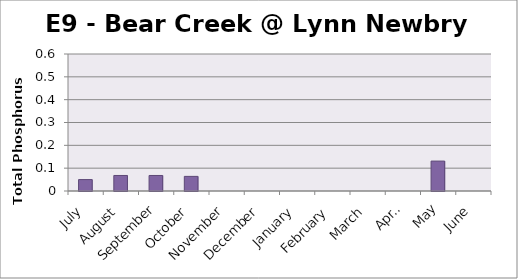
| Category | Phosphorus (mg/L) |
|---|---|
| July | 0.05 |
| August | 0.068 |
| September | 0.068 |
| October | 0.064 |
| November | 0 |
| December | 0 |
| January | 0 |
| February | 0 |
| March | 0 |
| April | 0 |
| May | 0.131 |
| June | 0 |